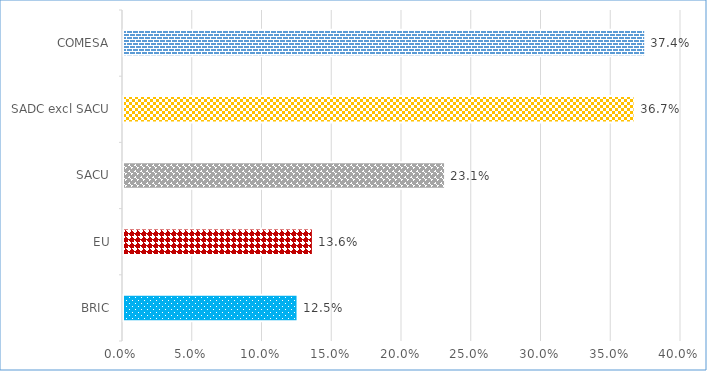
| Category | %Share |
|---|---|
| BRIC | 0.125 |
| EU | 0.136 |
| SACU | 0.231 |
| SADC excl SACU | 0.367 |
| COMESA | 0.374 |